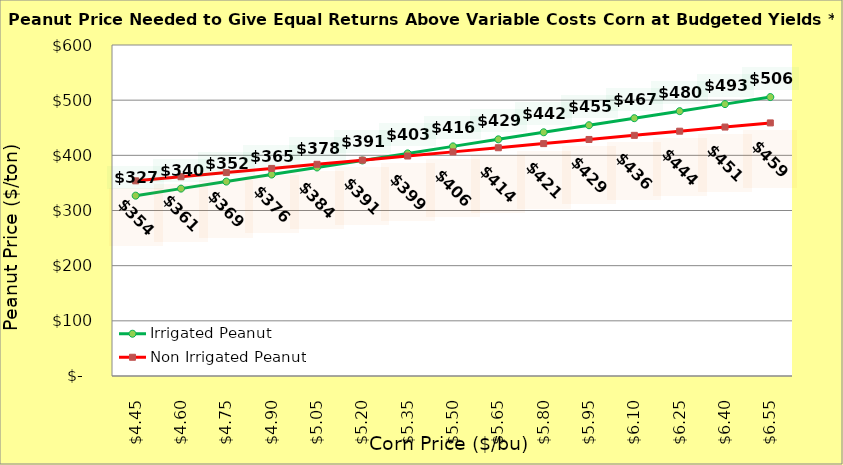
| Category | Irrigated Peanut | Non Irrigated Peanut |
|---|---|---|
| 4.4499999999999975 | 326.898 | 353.758 |
| 4.599999999999998 | 339.664 | 361.258 |
| 4.749999999999998 | 352.43 | 368.758 |
| 4.899999999999999 | 365.196 | 376.258 |
| 5.049999999999999 | 377.962 | 383.758 |
| 5.199999999999999 | 390.728 | 391.258 |
| 5.35 | 403.494 | 398.758 |
| 5.5 | 416.26 | 406.258 |
| 5.65 | 429.026 | 413.758 |
| 5.800000000000001 | 441.792 | 421.258 |
| 5.950000000000001 | 454.558 | 428.758 |
| 6.100000000000001 | 467.324 | 436.258 |
| 6.250000000000002 | 480.09 | 443.758 |
| 6.400000000000002 | 492.856 | 451.258 |
| 6.5500000000000025 | 505.622 | 458.758 |